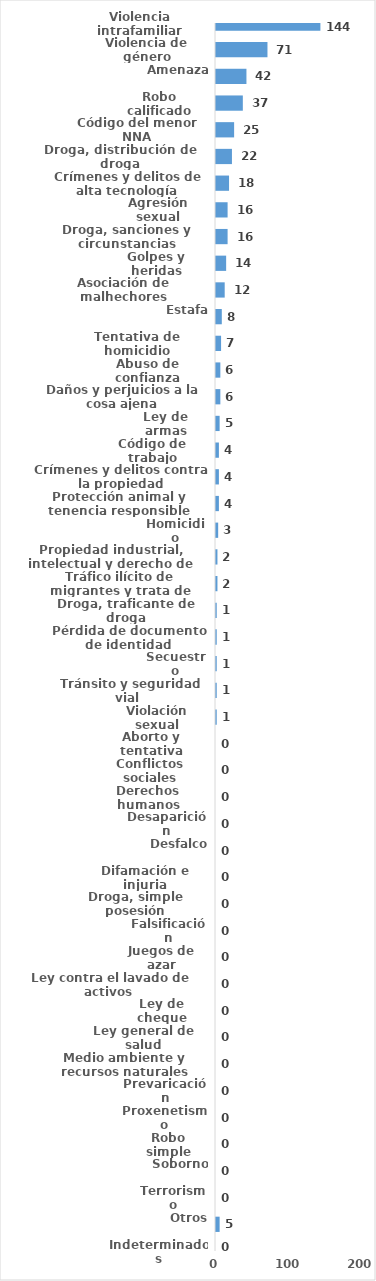
| Category | Series 0 |
|---|---|
| Violencia intrafamiliar | 144 |
| Violencia de género | 71 |
| Amenaza | 42 |
| Robo calificado | 37 |
| Código del menor NNA | 25 |
| Droga, distribución de droga | 22 |
| Crímenes y delitos de alta tecnología | 18 |
| Agresión sexual | 16 |
| Droga, sanciones y circunstancias agravantes | 16 |
| Golpes y heridas | 14 |
| Asociación de malhechores | 12 |
| Estafa | 8 |
| Tentativa de homicidio | 7 |
| Abuso de confianza | 6 |
| Daños y perjuicios a la cosa ajena | 6 |
| Ley de armas | 5 |
| Código de trabajo | 4 |
| Crímenes y delitos contra la propiedad | 4 |
| Protección animal y tenencia responsible | 4 |
| Homicidio | 3 |
| Propiedad industrial, intelectual y derecho de autor | 2 |
| Tráfico ilícito de migrantes y trata de personas | 2 |
| Droga, traficante de droga | 1 |
| Pérdida de documento de identidad | 1 |
| Secuestro | 1 |
| Tránsito y seguridad vial  | 1 |
| Violación sexual | 1 |
| Aborto y tentativa | 0 |
| Conflictos sociales | 0 |
| Derechos humanos | 0 |
| Desaparición | 0 |
| Desfalco | 0 |
| Difamación e injuria | 0 |
| Droga, simple posesión | 0 |
| Falsificación | 0 |
| Juegos de azar | 0 |
| Ley contra el lavado de activos  | 0 |
| Ley de cheque | 0 |
| Ley general de salud | 0 |
| Medio ambiente y recursos naturales | 0 |
| Prevaricación | 0 |
| Proxenetismo | 0 |
| Robo simple | 0 |
| Soborno | 0 |
| Terrorismo | 0 |
| Otros | 5 |
| Indeterminados | 0 |